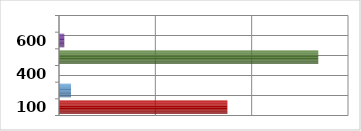
| Category | Series 0 |
|---|---|
| 100.0 | 34956721.54 |
| 200.0 | 2500000 |
| 400.0 | 0 |
| 500.0 | 53825680 |
| 600.0 | 1100000 |
| 700.0 | 0 |